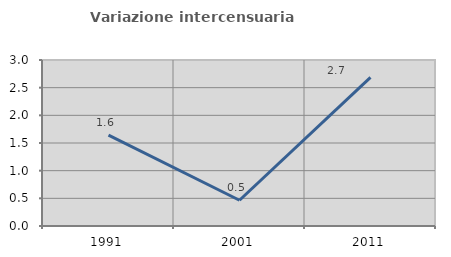
| Category | Variazione intercensuaria annua |
|---|---|
| 1991.0 | 1.643 |
| 2001.0 | 0.465 |
| 2011.0 | 2.686 |